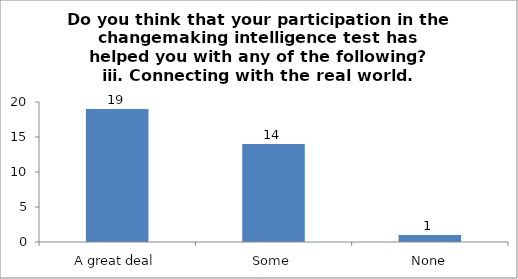
| Category | Do you think that your participation in the changemaking intelligence test has helped you with any of the following?
iii. Connecting with the real world. |
|---|---|
| A great deal | 19 |
| Some | 14 |
| None | 1 |